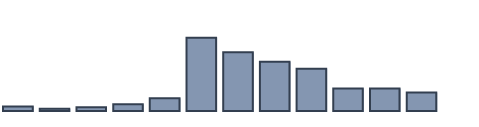
| Category | Series 0 |
|---|---|
| 0 | 1.4 |
| 1 | 0.7 |
| 2 | 1.2 |
| 3 | 2.1 |
| 4 | 4 |
| 5 | 23.1 |
| 6 | 18.5 |
| 7 | 15.5 |
| 8 | 13.3 |
| 9 | 7.1 |
| 10 | 7.1 |
| 11 | 5.8 |
| 12 | 0 |